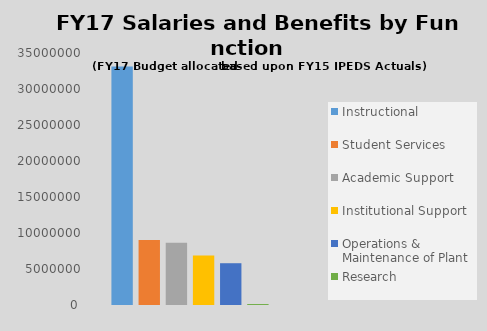
| Category | Instructional | Student Services | Academic Support | Institutional Support | Operations & Maintenance of Plant | Research |
|---|---|---|---|---|---|---|
| 0 | 33121450.252 | 9021555 | 8652549 | 6890229 | 5802298 | 133606 |